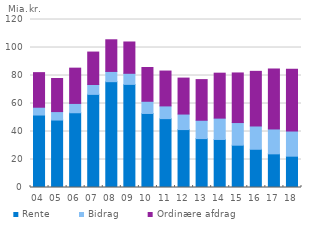
| Category | Rente | Bidrag | Ordinære afdrag |
|---|---|---|---|
| 04 | 51.76 | 5.58 | 24.71 |
| 05 | 48.18 | 6.04 | 23.65 |
| 06 | 53.39 | 6.66 | 25.2 |
| 07 | 66.52 | 7.07 | 23.15 |
| 08 | 75.59 | 7.31 | 22.61 |
| 09 | 73.66 | 7.91 | 22.37 |
| 10 | 52.88 | 8.71 | 24.12 |
| 11 | 49.18 | 9.1 | 24.9 |
| 12 | 41.38 | 11.08 | 25.69 |
| 13 | 34.93 | 13.1 | 29.04 |
| 14 | 34.31 | 15.24 | 32.11 |
| 15 | 30.22 | 16.17 | 35.43 |
| 16 | 27.31 | 16.63 | 39.03 |
| 17 | 24.04 | 17.78 | 42.83 |
| 18 | 22.37 | 17.97 | 44.12 |